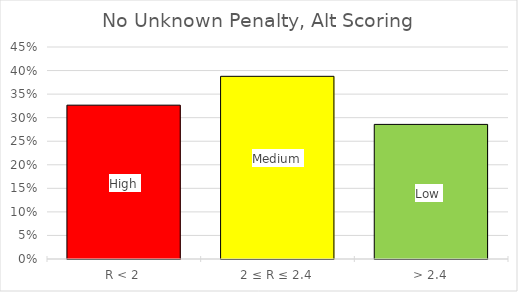
| Category | Frequency |
|---|---|
| R < 2 | 0.327 |
| 2 ≤ R ≤ 2.4 | 0.388 |
| > 2.4 | 0.286 |